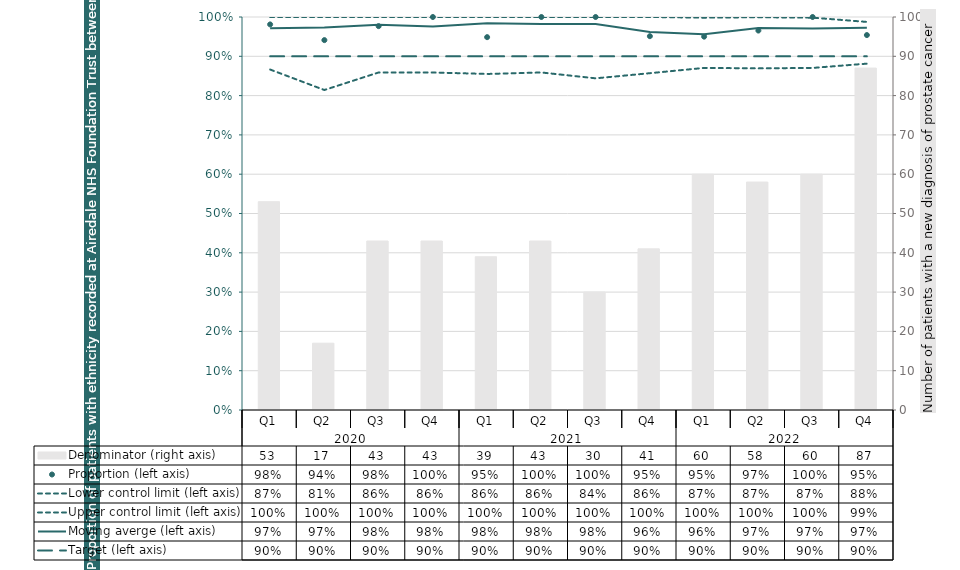
| Category | Denominator (right axis) |
|---|---|
| 0 | 53 |
| 1 | 17 |
| 2 | 43 |
| 3 | 43 |
| 4 | 39 |
| 5 | 43 |
| 6 | 30 |
| 7 | 41 |
| 8 | 60 |
| 9 | 58 |
| 10 | 60 |
| 11 | 87 |